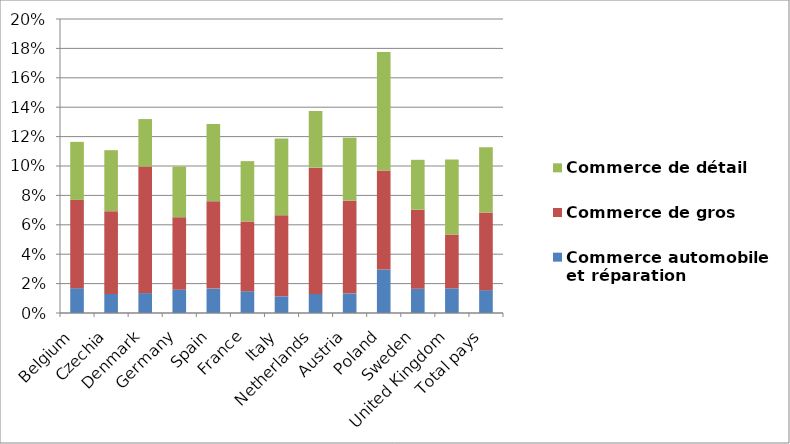
| Category | Commerce automobile et réparation | Commerce de gros | Commerce de détail |
|---|---|---|---|
| Belgium | 0.017 | 0.06 | 0.04 |
| Czechia | 0.013 | 0.056 | 0.041 |
| Denmark | 0.014 | 0.086 | 0.032 |
| Germany | 0.016 | 0.049 | 0.034 |
| Spain | 0.017 | 0.059 | 0.053 |
| France | 0.015 | 0.048 | 0.041 |
| Italy | 0.011 | 0.055 | 0.052 |
| Netherlands | 0.013 | 0.086 | 0.039 |
| Austria | 0.013 | 0.063 | 0.043 |
| Poland | 0.03 | 0.067 | 0.081 |
| Sweden | 0.017 | 0.054 | 0.034 |
| United Kingdom | 0.017 | 0.037 | 0.051 |
| Total pays | 0.016 | 0.053 | 0.044 |